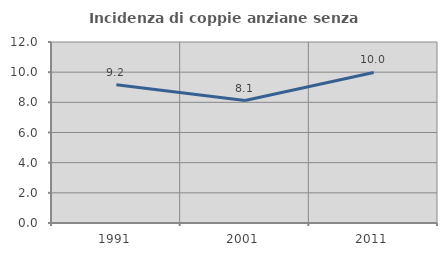
| Category | Incidenza di coppie anziane senza figli  |
|---|---|
| 1991.0 | 9.172 |
| 2001.0 | 8.117 |
| 2011.0 | 9.983 |